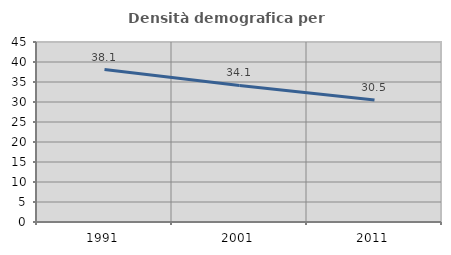
| Category | Densità demografica |
|---|---|
| 1991.0 | 38.116 |
| 2001.0 | 34.14 |
| 2011.0 | 30.524 |